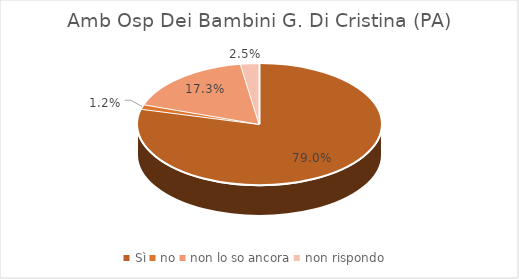
| Category | Amb Osp Dei Bambini G. Di Cristina (PA) |
|---|---|
| Sì | 0.79 |
| no | 0.012 |
| non lo so ancora | 0.173 |
| non rispondo | 0.025 |